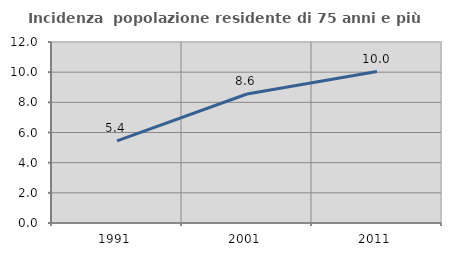
| Category | Incidenza  popolazione residente di 75 anni e più |
|---|---|
| 1991.0 | 5.446 |
| 2001.0 | 8.552 |
| 2011.0 | 10.039 |